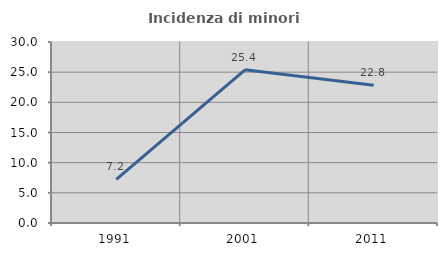
| Category | Incidenza di minori stranieri |
|---|---|
| 1991.0 | 7.229 |
| 2001.0 | 25.397 |
| 2011.0 | 22.829 |